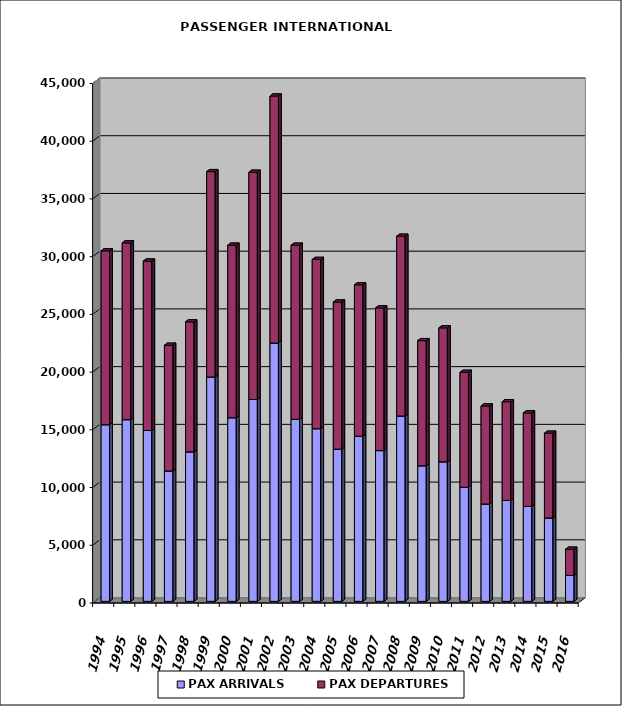
| Category | PAX ARRIVALS | PAX DEPARTURES |
|---|---|---|
| 1994.0 | 15300 | 15059 |
| 1995.0 | 15739 | 15311 |
| 1996.0 | 14799 | 14676 |
| 1997.0 | 11293 | 10891 |
| 1998.0 | 12949 | 11262 |
| 1999.0 | 19438 | 17784 |
| 2000.0 | 15907 | 14945 |
| 2001.0 | 17484 | 19683 |
| 2002.0 | 22372 | 21400 |
| 2003.0 | 15776 | 15072 |
| 2004.0 | 14956 | 14659 |
| 2005.0 | 13182 | 12747 |
| 2006.0 | 14307 | 13109 |
| 2007.0 | 13059 | 12358 |
| 2008.0 | 16058 | 15569 |
| 2009.0 | 11745 | 10837 |
| 2010.0 | 12090 | 11598 |
| 2011.0 | 9885 | 9954 |
| 2012.0 | 8433 | 8491 |
| 2013.0 | 8735 | 8559 |
| 2014.0 | 8228 | 8095 |
| 2015.0 | 7224 | 7341 |
| 2016.0 | 2253 | 2266 |